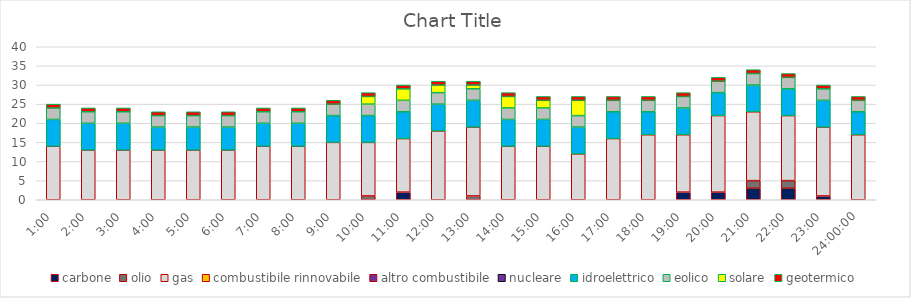
| Category | carbone | olio | gas | combustibile rinnovabile | altro combustibile | nucleare | idroelettrico | eolico | solare | geotermico |
|---|---|---|---|---|---|---|---|---|---|---|
| 0.041666666666666664 | 0 | 0 | 14 | 0 | 0 | 0 | 7 | 3 | 0 | 1 |
| 0.08333333333333333 | 0 | 0 | 13 | 0 | 0 | 0 | 7 | 3 | 0 | 1 |
| 0.125 | 0 | 0 | 13 | 0 | 0 | 0 | 7 | 3 | 0 | 1 |
| 0.16666666666666666 | 0 | 0 | 13 | 0 | 0 | 0 | 6 | 3 | 0 | 1 |
| 0.20833333333333334 | 0 | 0 | 13 | 0 | 0 | 0 | 6 | 3 | 0 | 1 |
| 0.25 | 0 | 0 | 13 | 0 | 0 | 0 | 6 | 3 | 0 | 1 |
| 0.2916666666666667 | 0 | 0 | 14 | 0 | 0 | 0 | 6 | 3 | 0 | 1 |
| 0.3333333333333333 | 0 | 0 | 14 | 0 | 0 | 0 | 6 | 3 | 0 | 1 |
| 0.375 | 0 | 0 | 15 | 0 | 0 | 0 | 7 | 3 | 0 | 1 |
| 0.4166666666666667 | 0 | 1 | 14 | 0 | 0 | 0 | 7 | 3 | 2 | 1 |
| 0.4583333333333333 | 2 | 0 | 14 | 0 | 0 | 0 | 7 | 3 | 3 | 1 |
| 0.5 | 0 | 0 | 18 | 0 | 0 | 0 | 7 | 3 | 2 | 1 |
| 0.5416666666666666 | 0 | 1 | 18 | 0 | 0 | 0 | 7 | 3 | 1 | 1 |
| 0.5833333333333334 | 0 | 0 | 14 | 0 | 0 | 0 | 7 | 3 | 3 | 1 |
| 0.625 | 0 | 0 | 14 | 0 | 0 | 0 | 7 | 3 | 2 | 1 |
| 0.6666666666666666 | 0 | 0 | 12 | 0 | 0 | 0 | 7 | 3 | 4 | 1 |
| 0.7083333333333334 | 0 | 0 | 16 | 0 | 0 | 0 | 7 | 3 | 0 | 1 |
| 0.75 | 0 | 0 | 17 | 0 | 0 | 0 | 6 | 3 | 0 | 1 |
| 0.7916666666666666 | 2 | 0 | 15 | 0 | 0 | 0 | 7 | 3 | 0 | 1 |
| 0.8333333333333334 | 2 | 0 | 20 | 0 | 0 | 0 | 6 | 3 | 0 | 1 |
| 0.875 | 3 | 2 | 18 | 0 | 0 | 0 | 7 | 3 | 0 | 1 |
| 0.9166666666666666 | 3 | 2 | 17 | 0 | 0 | 0 | 7 | 3 | 0 | 1 |
| 0.9583333333333334 | 1 | 0 | 18 | 0 | 0 | 0 | 7 | 3 | 0 | 1 |
| 1900-01-01 | 0 | 0 | 17 | 0 | 0 | 0 | 6 | 3 | 0 | 1 |